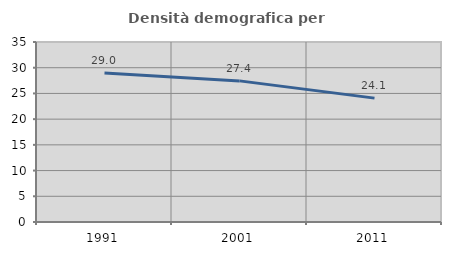
| Category | Densità demografica |
|---|---|
| 1991.0 | 28.964 |
| 2001.0 | 27.44 |
| 2011.0 | 24.086 |